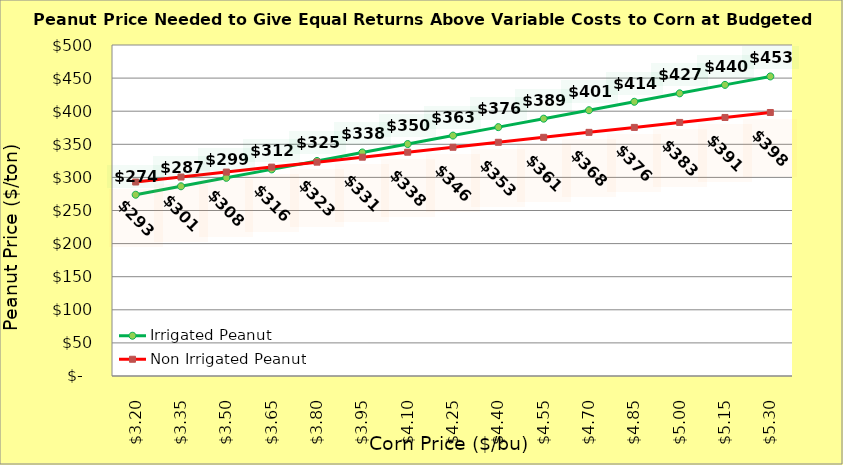
| Category | Irrigated Peanut | Non Irrigated Peanut |
|---|---|---|
| 3.2 | 273.802 | 293.038 |
| 3.35 | 286.568 | 300.538 |
| 3.5 | 299.334 | 308.038 |
| 3.65 | 312.1 | 315.538 |
| 3.8 | 324.866 | 323.038 |
| 3.9499999999999997 | 337.632 | 330.538 |
| 4.1 | 350.398 | 338.038 |
| 4.25 | 363.164 | 345.538 |
| 4.4 | 375.93 | 353.038 |
| 4.550000000000001 | 388.696 | 360.538 |
| 4.700000000000001 | 401.462 | 368.038 |
| 4.850000000000001 | 414.228 | 375.538 |
| 5.000000000000002 | 426.994 | 383.038 |
| 5.150000000000002 | 439.76 | 390.538 |
| 5.3000000000000025 | 452.526 | 398.038 |